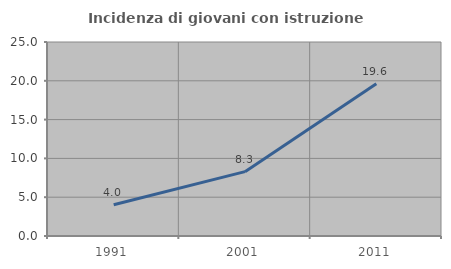
| Category | Incidenza di giovani con istruzione universitaria |
|---|---|
| 1991.0 | 4.021 |
| 2001.0 | 8.29 |
| 2011.0 | 19.632 |